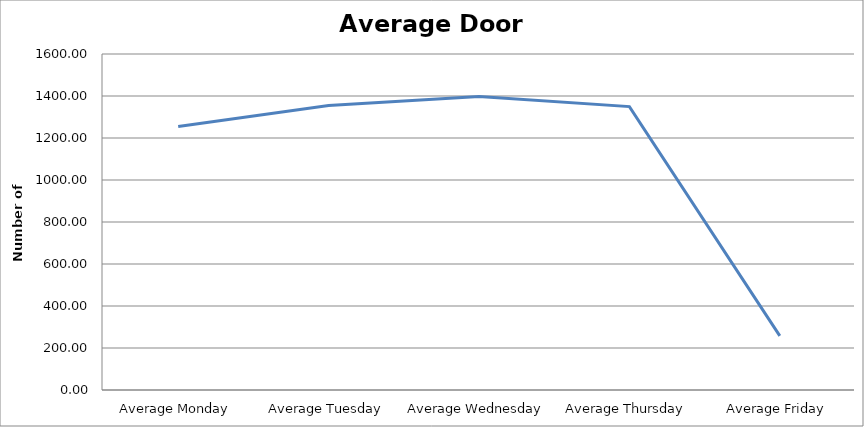
| Category | Series 0 |
|---|---|
| Average Monday | 1255 |
| Average Tuesday | 1354.5 |
| Average Wednesday | 1397.25 |
| Average Thursday | 1349.5 |
| Average Friday | 257.75 |